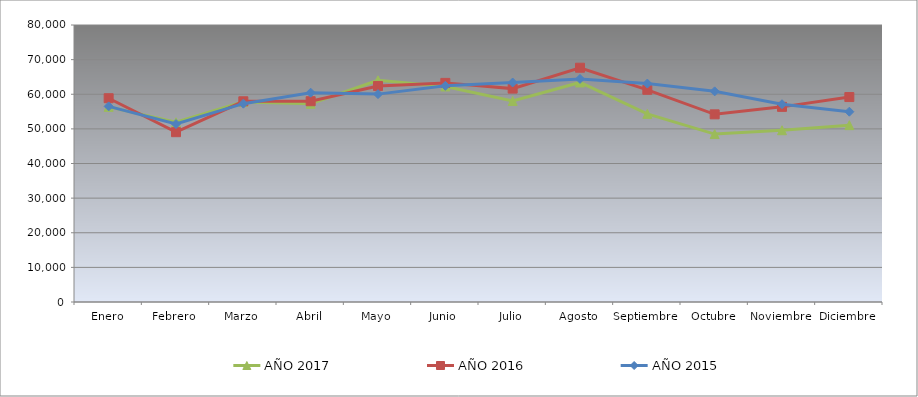
| Category | AÑO 2017 | AÑO 2016 | AÑO 2015 |
|---|---|---|---|
| Enero | 56361.04 | 58850.569 | 56494.419 |
| Febrero | 51900.013 | 49045.472 | 51396.573 |
| Marzo | 57796.598 | 57969.736 | 57279.064 |
| Abril | 57248.409 | 57984.394 | 60451.816 |
| Mayo | 64016.795 | 62392.557 | 60039.056 |
| Junio | 62249.012 | 63284.05 | 62429.844 |
| Julio | 58059.595 | 61626.325 | 63394.736 |
| Agosto | 63410.973 | 67662.896 | 64433.335 |
| Septiembre | 54336.553 | 61285.186 | 63082.486 |
| Octubre | 48490.978 | 54198.545 | 60836.432 |
| Noviembre | 49609.216 | 56357.985 | 57112.888 |
| Diciembre | 51074.584 | 59191.709 | 54961.313 |